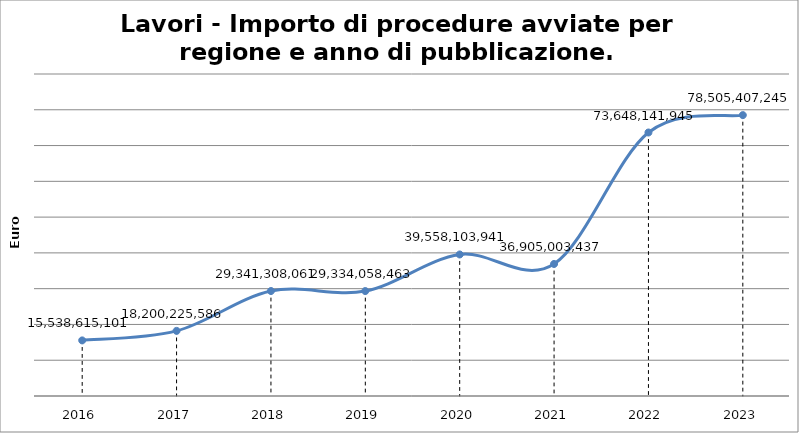
| Category | Totale |
|---|---|
| 2016.0 | 15538615101 |
| 2017.0 | 18200225586 |
| 2018.0 | 29341308061 |
| 2019.0 | 29334058463 |
| 2020.0 | 39558103941 |
| 2021.0 | 36905003437 |
| 2022.0 | 73648141945 |
| 2023.0 | 78505407245 |